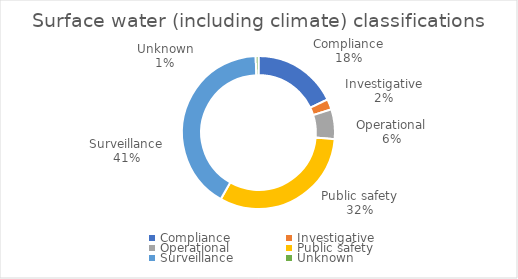
| Category | Series 0 |
|---|---|
| Compliance | 0.179 |
| Investigative | 0.022 |
| Operational | 0.063 |
| Public safety | 0.318 |
| Surveillance | 0.412 |
| Unknown | 0.006 |